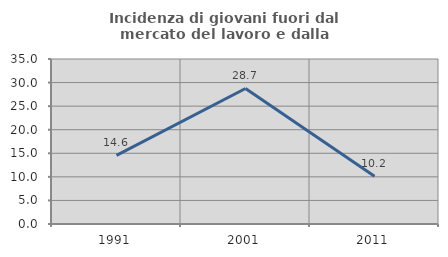
| Category | Incidenza di giovani fuori dal mercato del lavoro e dalla formazione  |
|---|---|
| 1991.0 | 14.57 |
| 2001.0 | 28.745 |
| 2011.0 | 10.152 |